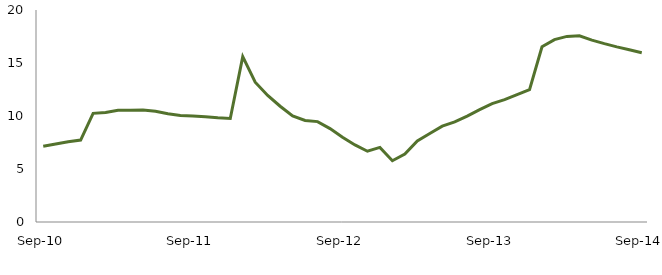
| Category | Series 0 |
|---|---|
| Sep-10 | 7.146 |
|  | 7.351 |
|  | 7.58 |
|  | 7.73 |
|  | 10.248 |
|  | 10.324 |
|  | 10.533 |
|  | 10.537 |
|  | 10.57 |
|  | 10.452 |
|  | 10.207 |
|  | 10.049 |
| Sep-11 | 10.007 |
|  | 9.921 |
|  | 9.825 |
|  | 9.769 |
|  | 15.6 |
|  | 13.183 |
|  | 11.939 |
|  | 10.922 |
|  | 10 |
|  | 9.58 |
|  | 9.469 |
|  | 8.808 |
| Sep-12 | 7.988 |
|  | 7.268 |
|  | 6.674 |
|  | 7.037 |
|  | 5.783 |
|  | 6.416 |
|  | 7.652 |
|  | 8.343 |
|  | 9.038 |
|  | 9.444 |
|  | 9.997 |
|  | 10.606 |
| Sep-13 | 11.164 |
|  | 11.55 |
|  | 12.014 |
|  | 12.486 |
|  | 16.529 |
|  | 17.207 |
|  | 17.508 |
|  | 17.569 |
|  | 17.163 |
|  | 16.827 |
|  | 16.521 |
|  | 16.256 |
| Sep-14 | 15.969 |